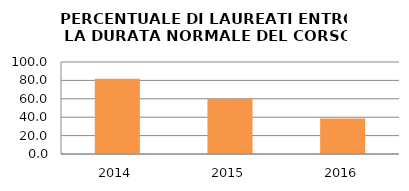
| Category | 2014 2015 2016 |
|---|---|
| 2014.0 | 81.818 |
| 2015.0 | 60 |
| 2016.0 | 38.462 |